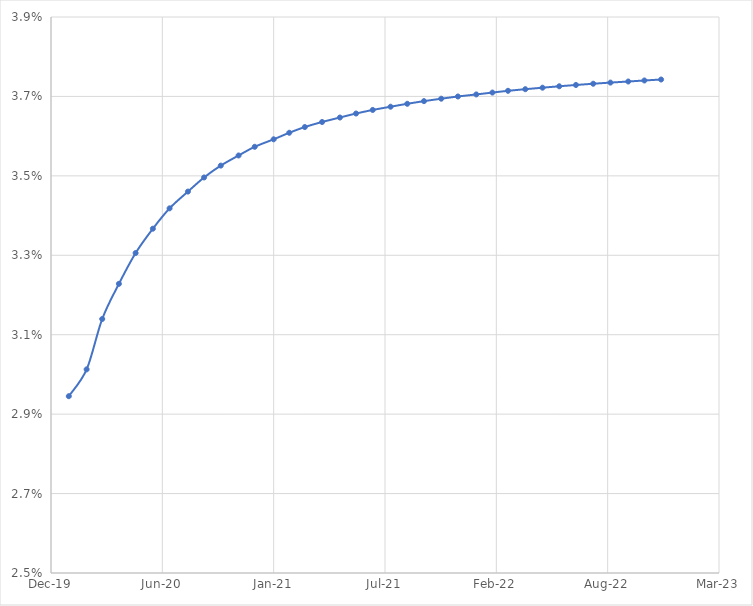
| Category | Series 0 |
|---|---|
| 43832.0 | 0.029 |
| 43864.0 | 0.03 |
| 43892.0 | 0.031 |
| 43922.0 | 0.032 |
| 43952.0 | 0.033 |
| 43983.0 | 0.034 |
| 44013.0 | 0.034 |
| 44046.0 | 0.035 |
| 44075.0 | 0.035 |
| 44105.0 | 0.035 |
| 44137.0 | 0.036 |
| 44166.0 | 0.036 |
| 44200.0 | 0.036 |
| 44228.0 | 0.036 |
| 44256.0 | 0.036 |
| 44287.0 | 0.036 |
| 44319.0 | 0.036 |
| 44348.0 | 0.037 |
| 44378.0 | 0.037 |
| 44410.0 | 0.037 |
| 44440.0 | 0.037 |
| 44470.0 | 0.037 |
| 44501.0 | 0.037 |
| 44531.0 | 0.037 |
| 44564.0 | 0.037 |
| 44593.0 | 0.037 |
| 44621.0 | 0.037 |
| 44652.0 | 0.037 |
| 44683.0 | 0.037 |
| 44713.0 | 0.037 |
| 44743.0 | 0.037 |
| 44774.0 | 0.037 |
| 44805.0 | 0.037 |
| 44837.0 | 0.037 |
| 44866.0 | 0.037 |
| 44896.0 | 0.037 |